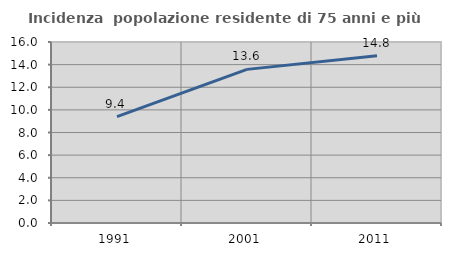
| Category | Incidenza  popolazione residente di 75 anni e più |
|---|---|
| 1991.0 | 9.401 |
| 2001.0 | 13.58 |
| 2011.0 | 14.782 |